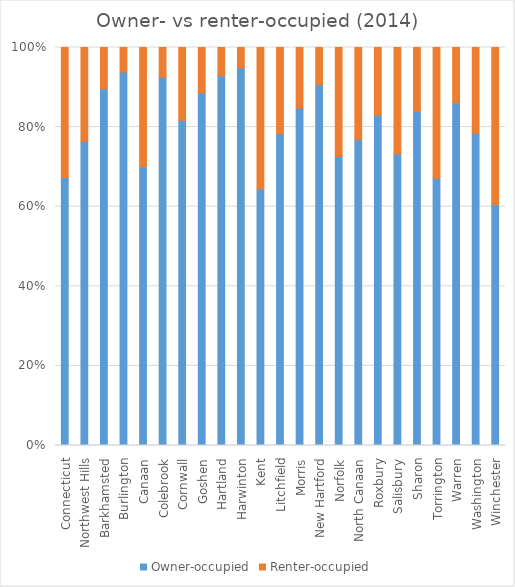
| Category | Owner-occupied | Renter-occupied |
|---|---|---|
| Connecticut | 913043 | 443163 |
| Northwest Hills | 35374 | 10954 |
| Barkhamsted | 1322 | 153 |
| Burlington | 3173 | 208 |
| Canaan | 403 | 172 |
| Colebrook | 569 | 46 |
| Cornwall | 507 | 114 |
| Goshen | 1085 | 140 |
| Hartland | 707 | 54 |
| Harwinton | 1966 | 106 |
| Kent | 725 | 400 |
| Litchfield | 2707 | 747 |
| Morris | 784 | 141 |
| New Hartford | 2450 | 252 |
| Norfolk | 461 | 174 |
| North Canaan | 997 | 301 |
| Roxbury | 784 | 161 |
| Salisbury | 1098 | 401 |
| Sharon | 1059 | 202 |
| Torrington | 9953 | 4867 |
| Warren | 495 | 80 |
| Washington | 1212 | 333 |
| Winchester | 2917 | 1902 |